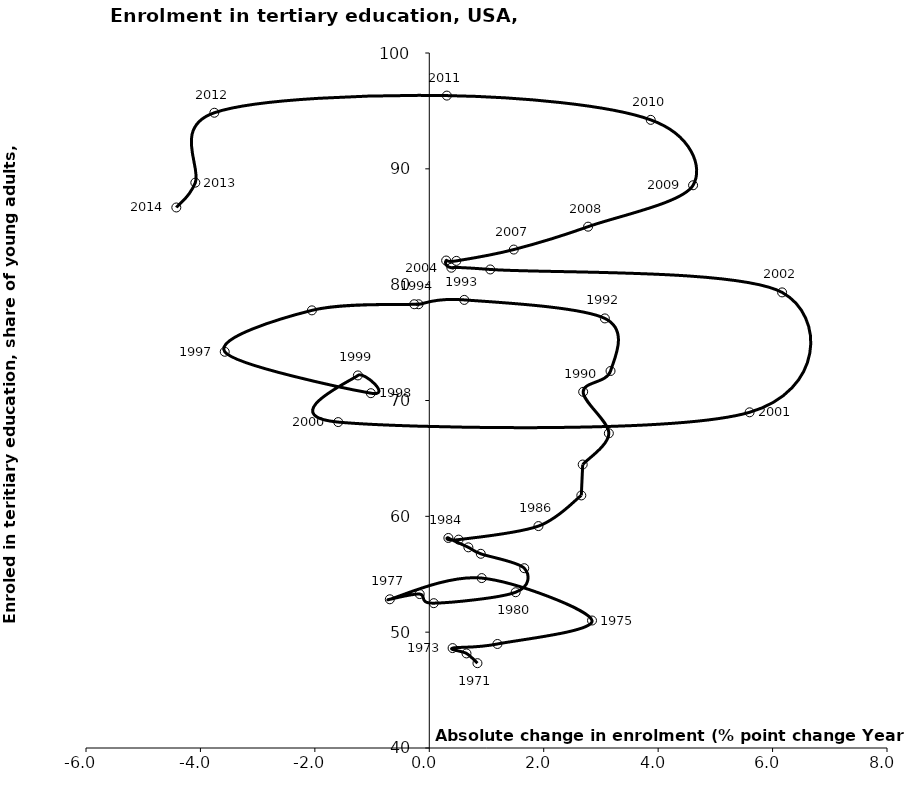
| Category | Series 0 |
|---|---|
| 0.8418998718261008 | 47.323 |
| 0.6501293182373011 | 48.165 |
| 0.4074058532714986 | 48.624 |
| 1.191095352172848 | 48.98 |
| 2.8443584442138494 | 51.006 |
| 0.9163856506347514 | 54.669 |
| -0.6896896362304474 | 52.839 |
| -0.16778564453125 | 53.29 |
| 0.07852554321289773 | 52.503 |
| 1.5092601776122976 | 53.447 |
| 1.6599845886230504 | 55.522 |
| 0.9002056121826527 | 56.767 |
| 0.6831398010254013 | 57.322 |
| 0.333660125732397 | 58.133 |
| 0.5128612518310476 | 57.989 |
| 1.9077091217041016 | 59.159 |
| 2.6573524475097514 | 61.805 |
| 2.6814498901366974 | 64.473 |
| 3.1383934020996023 | 67.168 |
| 2.689701080322301 | 70.75 |
| 3.167934417724595 | 72.547 |
| 3.068843841552699 | 77.086 |
| 0.6115074157715057 | 78.685 |
| -0.187400817871044 | 78.309 |
| -0.2635345458984517 | 78.31 |
| -2.0516242980957315 | 77.782 |
| -3.575119018554652 | 74.207 |
| -1.021270751953125 | 70.632 |
| -1.2476615905762003 | 72.164 |
| -1.5920372009277486 | 68.136 |
| 5.59832763671875 | 68.98 |
| 6.166553497314453 | 79.333 |
| 1.0652999877930043 | 81.313 |
| 0.3856010437012003 | 81.464 |
| 0.29471969604489345 | 82.084 |
| 0.47330856323240056 | 82.053 |
| 1.4769096374511506 | 83.031 |
| 2.775341033935547 | 85.007 |
| 4.610595703125 | 88.582 |
| 3.8703308105469034 | 94.228 |
| 0.30713272094730115 | 96.322 |
| -3.7569160461425994 | 94.842 |
| -4.089157104492202 | 88.809 |
| -4.421398162841804 | 86.664 |